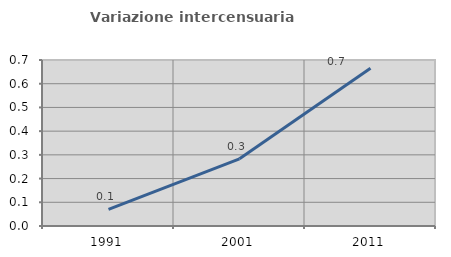
| Category | Variazione intercensuaria annua |
|---|---|
| 1991.0 | 0.071 |
| 2001.0 | 0.283 |
| 2011.0 | 0.665 |